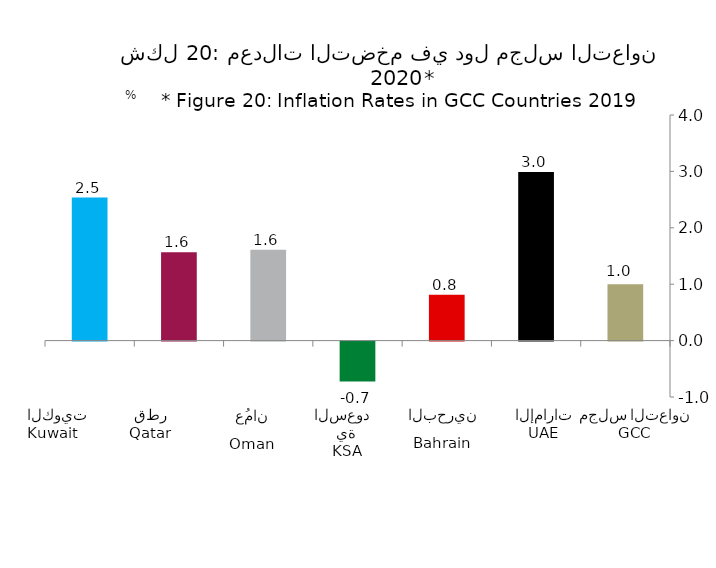
| Category | Series 1 |
|---|---|
|  | 1 |
|  | 2.991 |
|  | 0.813 |
|  | -0.706 |
|  | 1.612 |
|  | 1.568 |
|  | 2.536 |